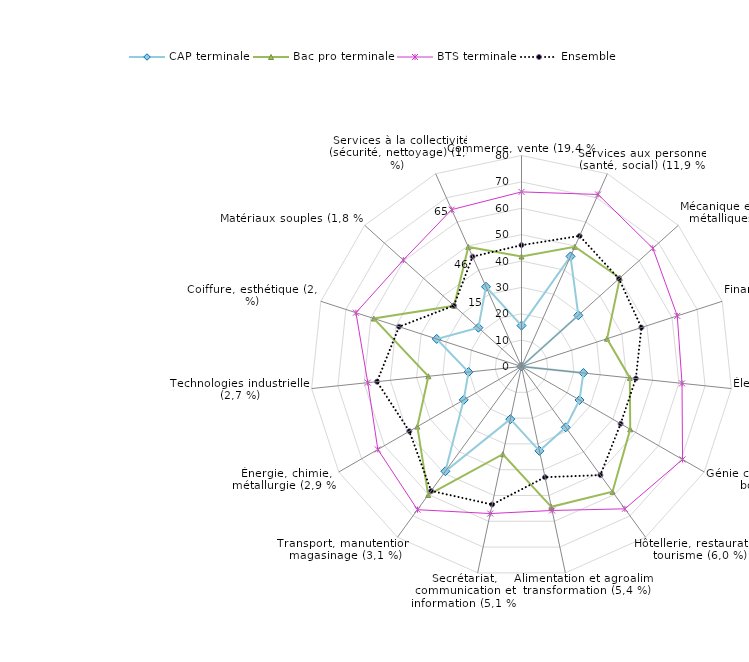
| Category | CAP terminale | Bac pro terminale | BTS terminale | Ensemble |
|---|---|---|---|---|
| Commerce, vente (19,4 %) | 15.5 | 41.7 | 66.2 | 46 |
| Services aux personnes (santé, social) (11,9 %) | 45.7 | 49.7 | 71.4 | 54.2 |
| Mécanique et structures métalliques (11,3 %) | 29 | 50.2 | 67 | 49.7 |
| Finances, comptabilité (11,2 %) | 0 | 34.1 | 62.1 | 47.8 |
| Électricité, électronique (8,1 %) | 23.6 | 41.3 | 61.2 | 43.6 |
| Génie civil, construction, bois (7,5 %) | 25.4 | 47.6 | 70.5 | 43.4 |
| Hôtellerie, restauration, tourisme (6,0 %) | 28.5 | 58.7 | 66.7 | 50.9 |
| Alimentation et agroalim., transformation (5,4 %) | 32.7 | 54.4 | 55.8 | 42.9 |
| Secrétariat, communication et information (5,1 %) | 20.4 | 34 | 57 | 53.5 |
| Transport, manutention, magasinage (3,1 %) | 49.1 | 60.2 | 67.1 | 58.3 |
| Énergie, chimie, métallurgie (2,9 %) | 25.3 | 45.6 | 62.9 | 49.1 |
| Technologies industrielles (2,7 %) | 20.2 | 35.5 | 58.6 | 55.1 |
| Coiffure, esthétique (2,1 %) | 33.8 | 58.9 | 66 | 48.8 |
| Matériaux souples (1,8 %) | 22 | 34.4 | 60.3 | 34.5 |
| Services à la collectivité (sécurité, nettoyage) (1,8 %) | 33.1 | 49.6 | 65.1 | 45.6 |